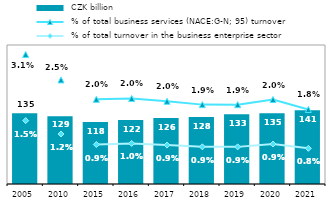
| Category |  CZK billion |
|---|---|
| 2005.0 | 134.976 |
| 2010.0 | 129.105 |
| 2015.0 | 118.336 |
| 2016.0 | 121.884 |
| 2017.0 | 125.872 |
| 2018.0 | 127.568 |
| 2019.0 | 132.752 |
| 2020.0 | 134.726 |
| 2021.0 | 140.786 |